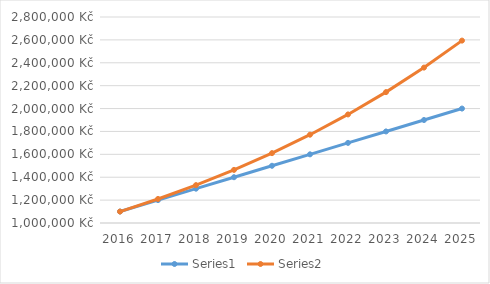
| Category | Series 0 | Series 1 |
|---|---|---|
| 2016.0 | 1100000 | 1100000 |
| 2017.0 | 1200000 | 1210000 |
| 2018.0 | 1300000 | 1331000 |
| 2019.0 | 1400000 | 1464100 |
| 2020.0 | 1500000 | 1610510 |
| 2021.0 | 1600000 | 1771561 |
| 2022.0 | 1700000 | 1948717.1 |
| 2023.0 | 1800000 | 2143588.81 |
| 2024.0 | 1900000 | 2357947.691 |
| 2025.0 | 2000000 | 2593742.46 |